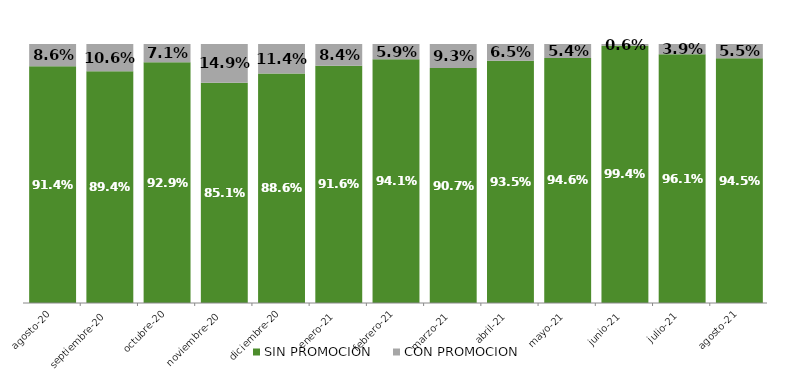
| Category | SIN PROMOCION   | CON PROMOCION   |
|---|---|---|
| 2020-08-01 | 0.914 | 0.086 |
| 2020-09-01 | 0.894 | 0.106 |
| 2020-10-01 | 0.929 | 0.071 |
| 2020-11-01 | 0.851 | 0.149 |
| 2020-12-01 | 0.886 | 0.114 |
| 2021-01-01 | 0.916 | 0.084 |
| 2021-02-01 | 0.941 | 0.059 |
| 2021-03-01 | 0.907 | 0.093 |
| 2021-04-01 | 0.935 | 0.065 |
| 2021-05-01 | 0.946 | 0.054 |
| 2021-06-01 | 0.994 | 0.006 |
| 2021-07-01 | 0.961 | 0.039 |
| 2021-08-01 | 0.945 | 0.055 |